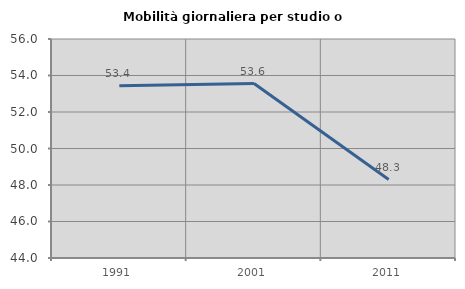
| Category | Mobilità giornaliera per studio o lavoro |
|---|---|
| 1991.0 | 53.441 |
| 2001.0 | 53.559 |
| 2011.0 | 48.301 |